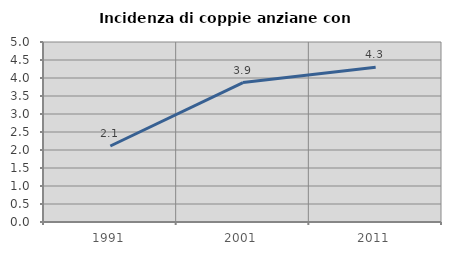
| Category | Incidenza di coppie anziane con figli |
|---|---|
| 1991.0 | 2.111 |
| 2001.0 | 3.872 |
| 2011.0 | 4.301 |